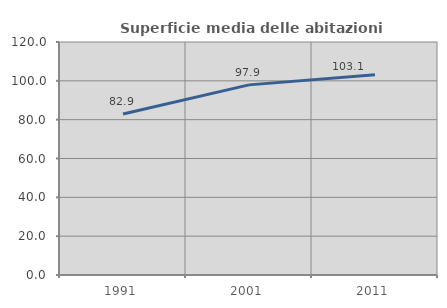
| Category | Superficie media delle abitazioni occupate |
|---|---|
| 1991.0 | 82.93 |
| 2001.0 | 97.92 |
| 2011.0 | 103.076 |